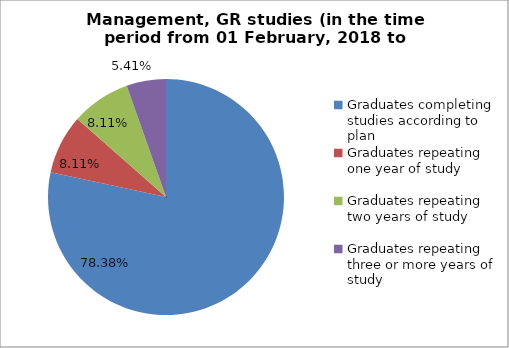
| Category | Series 0 |
|---|---|
| Graduates completing studies according to plan | 78.378 |
| Graduates repeating one year of study | 8.108 |
| Graduates repeating two years of study | 8.108 |
| Graduates repeating three or more years of study | 5.405 |